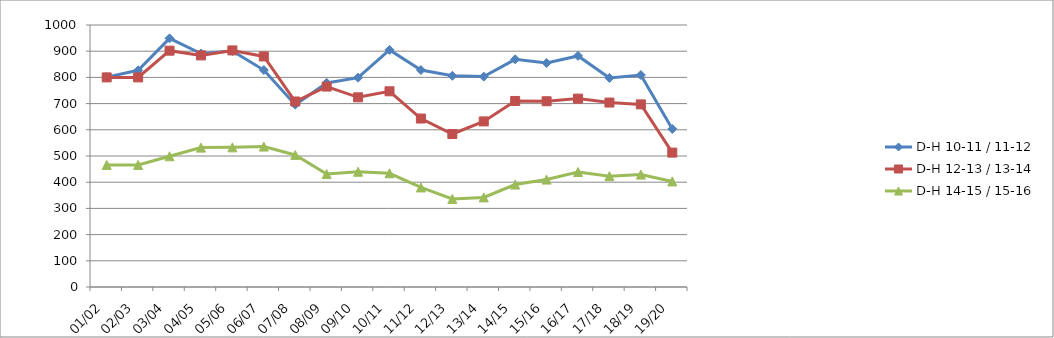
| Category | D-H 10-11 / 11-12 | D-H 12-13 / 13-14 | D-H 14-15 / 15-16 |
|---|---|---|---|
| 01/02 | 801 | 800 | 466 |
| 02/03 | 827 | 800 | 466 |
| 03/04 | 949 | 902 | 499 |
| 04/05 | 891 | 884 | 532 |
| 05/06 | 901 | 903 | 533 |
| 06/07 | 828 | 880 | 536 |
| 07/08 | 696 | 708 | 504 |
| 08/09 | 779 | 765 | 431 |
| 09/10 | 799 | 724 | 440 |
| 10/11 | 905 | 747 | 434 |
| 11/12 | 828 | 643 | 380 |
| 12/13 | 806 | 584 | 336 |
| 13/14 | 803 | 632 | 342 |
| 14/15 | 869 | 710 | 391 |
| 15/16 | 855 | 709 | 410 |
| 16/17 | 882 | 719 | 439 |
| 17/18 | 798 | 704 | 423 |
| 18/19 | 809 | 697 | 429 |
| 19/20 | 603 | 513 | 403 |